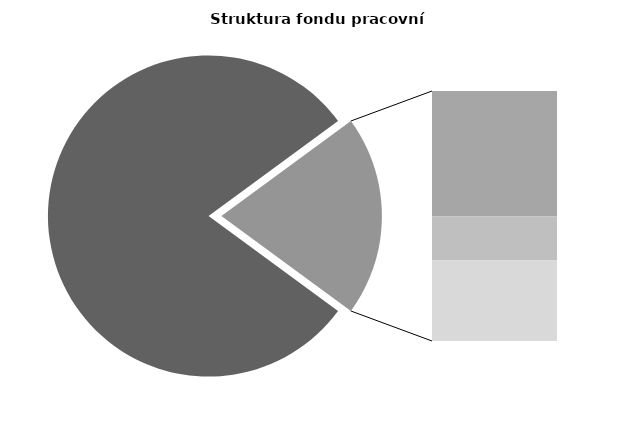
| Category | Series 0 |
|---|---|
| Průměrná měsíční odpracovaná doba bez přesčasu | 138.113 |
| Dovolená | 17.5 |
| Nemoc | 6.118 |
| Jiné | 11.236 |